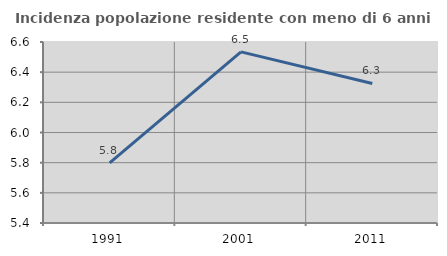
| Category | Incidenza popolazione residente con meno di 6 anni |
|---|---|
| 1991.0 | 5.798 |
| 2001.0 | 6.534 |
| 2011.0 | 6.325 |